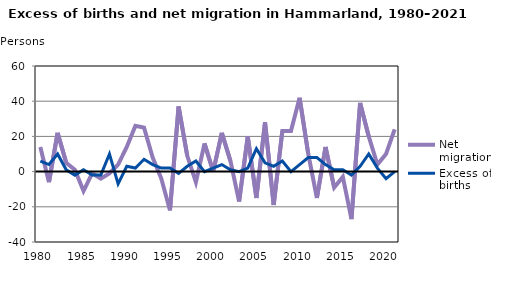
| Category | Net migration | Excess of births |
|---|---|---|
| 1980.0 | 14 | 6 |
| 1981.0 | -6 | 4 |
| 1982.0 | 22 | 10 |
| 1983.0 | 5 | 1 |
| 1984.0 | 1 | -2 |
| 1985.0 | -11 | 1 |
| 1986.0 | -1 | -2 |
| 1987.0 | -4 | -2 |
| 1988.0 | -1 | 10 |
| 1989.0 | 4 | -7 |
| 1990.0 | 14 | 3 |
| 1991.0 | 26 | 2 |
| 1992.0 | 25 | 7 |
| 1993.0 | 8 | 4 |
| 1994.0 | -4 | 2 |
| 1995.0 | -22 | 2 |
| 1996.0 | 37 | -1 |
| 1997.0 | 9 | 3 |
| 1998.0 | -6 | 6 |
| 1999.0 | 16 | 0 |
| 2000.0 | 0 | 2 |
| 2001.0 | 22 | 4 |
| 2002.0 | 6 | 1 |
| 2003.0 | -17 | 0 |
| 2004.0 | 20 | 2 |
| 2005.0 | -15 | 13 |
| 2006.0 | 28 | 5 |
| 2007.0 | -19 | 3 |
| 2008.0 | 23 | 6 |
| 2009.0 | 23 | 0 |
| 2010.0 | 42 | 4 |
| 2011.0 | 10 | 8 |
| 2012.0 | -15 | 8 |
| 2013.0 | 14 | 4 |
| 2014.0 | -9 | 1 |
| 2015.0 | -3 | 1 |
| 2016.0 | -27 | -2 |
| 2017.0 | 39 | 3 |
| 2018.0 | 20 | 10 |
| 2019.0 | 4 | 2 |
| 2020.0 | 10 | -4 |
| 2021.0 | 24 | 0 |